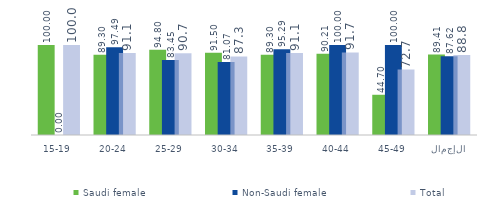
| Category | Saudi female  | Non-Saudi female | Total |
|---|---|---|---|
| 15-19 | 100 | 0 | 100 |
| 20-24 | 89.299 | 97.487 | 91.057 |
| 25-29 | 94.798 | 83.453 | 90.707 |
| 30-34 | 91.504 | 81.069 | 87.326 |
| 35-39 | 89.298 | 95.293 | 91.109 |
| 40-44 | 90.211 | 100 | 91.68 |
| 45-49 | 44.699 | 100 | 72.722 |
| الإجمالي | 89.411 | 87.619 | 88.809 |